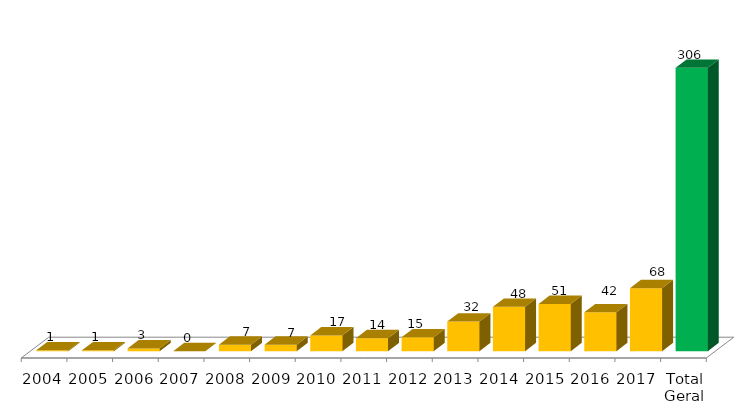
| Category | Categoria/Ano |
|---|---|
| 0 | 1 |
| 1 | 1 |
| 2 | 3 |
| 3 | 0 |
| 4 | 7 |
| 5 | 7 |
| 6 | 17 |
| 7 | 14 |
| 8 | 15 |
| 9 | 32 |
| 10 | 48 |
| 11 | 51 |
| 12 | 42 |
| 13 | 68 |
| 14 | 306 |